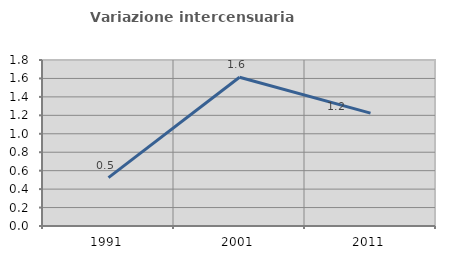
| Category | Variazione intercensuaria annua |
|---|---|
| 1991.0 | 0.524 |
| 2001.0 | 1.614 |
| 2011.0 | 1.224 |